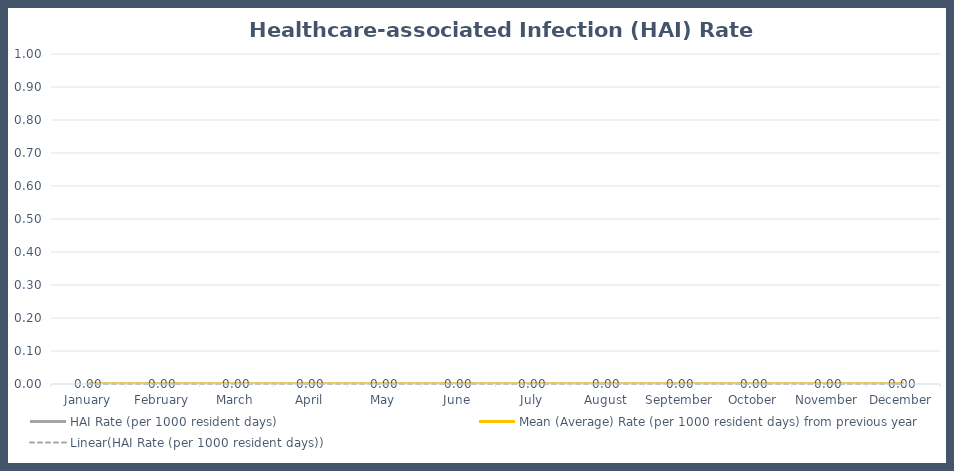
| Category | HAI Rate (per 1000 resident days) | Mean (Average) Rate (per 1000 resident days) from previous year |
|---|---|---|
| January | 0 |  |
| February | 0 |  |
| March | 0 |  |
| April | 0 |  |
| May | 0 |  |
| June | 0 |  |
| July | 0 |  |
| August | 0 |  |
| September | 0 |  |
| October | 0 |  |
| November | 0 |  |
| December | 0 |  |